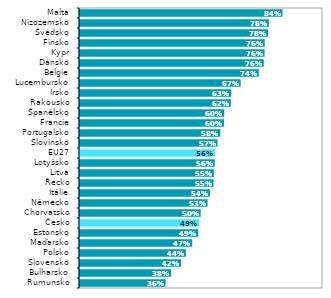
| Category | Series 0 |
|---|---|
| Rumunsko | 0.357 |
| Bulharsko | 0.379 |
| Slovensko | 0.42 |
| Polsko | 0.44 |
| Maďarsko | 0.466 |
| Estonsko | 0.491 |
| Česko | 0.495 |
| Chorvatsko | 0.501 |
| Německo | 0.529 |
| Itálie | 0.539 |
| Řecko | 0.554 |
| Litva | 0.555 |
| Lotyšsko | 0.559 |
| EU27 | 0.56 |
| Slovinsko | 0.57 |
| Portugalsko | 0.582 |
| Francie | 0.597 |
| Španělsko | 0.598 |
| Rakousko | 0.625 |
| Irsko | 0.627 |
| Lucembursko | 0.665 |
| Belgie | 0.74 |
| Dánsko | 0.76 |
| Kypr | 0.764 |
| Finsko | 0.764 |
| Švédsko | 0.778 |
| Nizozemsko | 0.781 |
| Malta | 0.838 |